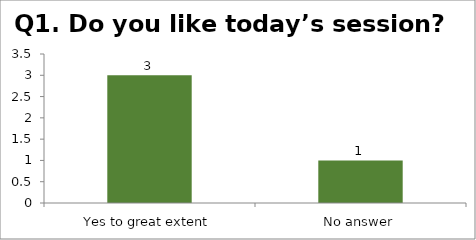
| Category | Q1. Do you like today’s session? |
|---|---|
| Yes to great extent | 3 |
| No answer | 1 |